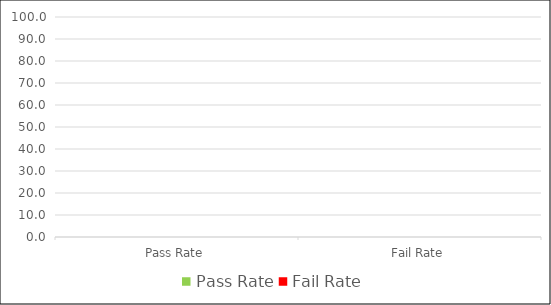
| Category | Series 0 |
|---|---|
| Pass Rate | 0 |
| Fail Rate | 0 |